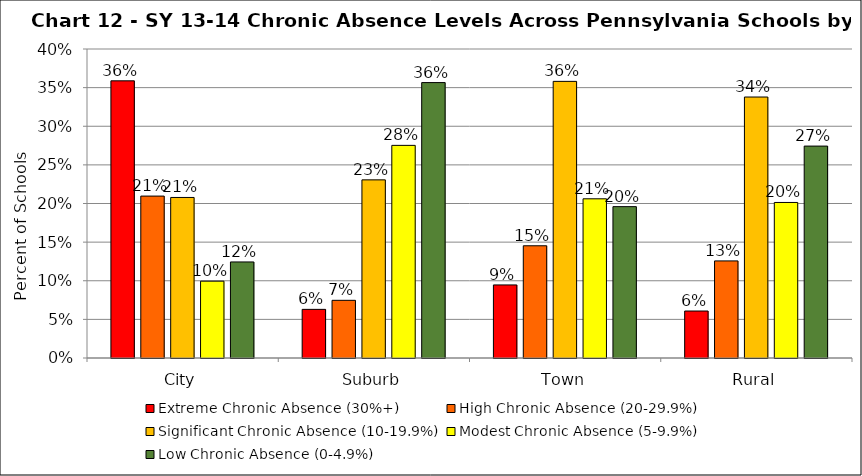
| Category | Extreme Chronic Absence (30%+) | High Chronic Absence (20-29.9%) | Significant Chronic Absence (10-19.9%) | Modest Chronic Absence (5-9.9%) | Low Chronic Absence (0-4.9%) |
|---|---|---|---|---|---|
| 0 | 0.359 | 0.21 | 0.208 | 0.099 | 0.124 |
| 1 | 0.063 | 0.075 | 0.231 | 0.275 | 0.357 |
| 2 | 0.095 | 0.145 | 0.358 | 0.206 | 0.196 |
| 3 | 0.061 | 0.126 | 0.338 | 0.201 | 0.274 |